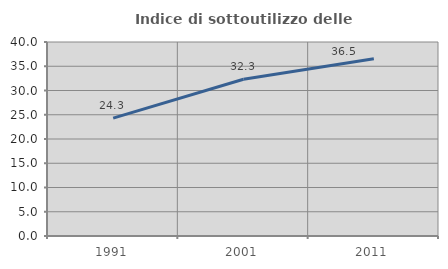
| Category | Indice di sottoutilizzo delle abitazioni  |
|---|---|
| 1991.0 | 24.296 |
| 2001.0 | 32.317 |
| 2011.0 | 36.546 |